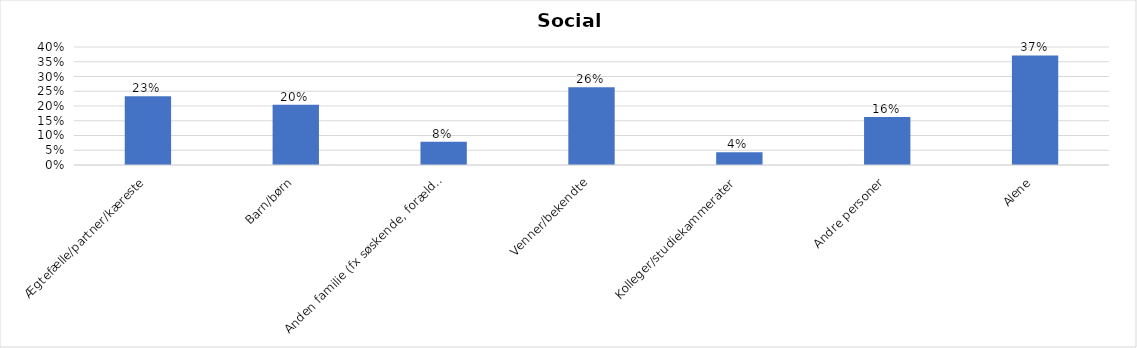
| Category | % |
|---|---|
| Ægtefælle/partner/kæreste | 0.233 |
| Barn/børn | 0.204 |
| Anden familie (fx søskende, forældre) | 0.079 |
| Venner/bekendte | 0.264 |
| Kolleger/studiekammerater | 0.044 |
| Andre personer | 0.163 |
| Alene | 0.371 |